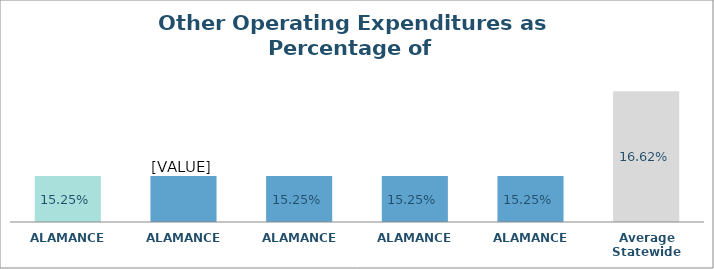
| Category | Series 0 |
|---|---|
| ALAMANCE  | 0.152 |
| ALAMANCE  | 0.152 |
| ALAMANCE  | 0.152 |
| ALAMANCE  | 0.152 |
| ALAMANCE  | 0.152 |
| Average Statewide | 0.166 |